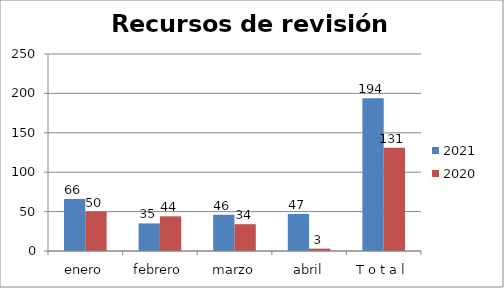
| Category | 2021 | 2020 |
|---|---|---|
| enero | 66 | 50 |
| febrero | 35 | 44 |
| marzo | 46 | 34 |
| abril | 47 | 3 |
| T o t a l | 194 | 131 |